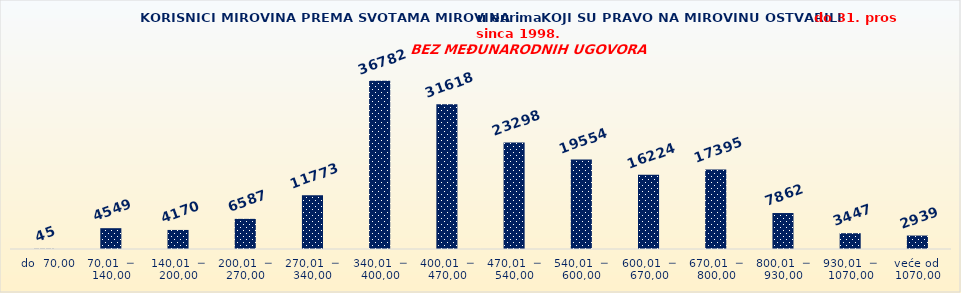
| Category | Series 0 |
|---|---|
|   do  70,00 | 45 |
| 70,01  ─  140,00 | 4549 |
| 140,01  ─  200,00 | 4170 |
| 200,01  ─  270,00 | 6587 |
| 270,01  ─  340,00 | 11773 |
| 340,01  ─  400,00 | 36782 |
| 400,01  ─  470,00 | 31618 |
| 470,01  ─  540,00 | 23298 |
| 540,01  ─  600,00 | 19554 |
| 600,01  ─  670,00 | 16224 |
| 670,01  ─  800,00 | 17395 |
| 800,01  ─  930,00 | 7862 |
| 930,01  ─  1070,00 | 3447 |
| veće od  1070,00 | 2939 |